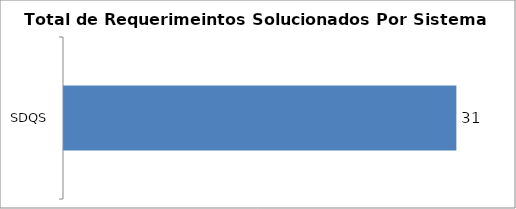
| Category | Total |
|---|---|
| SDQS | 31 |